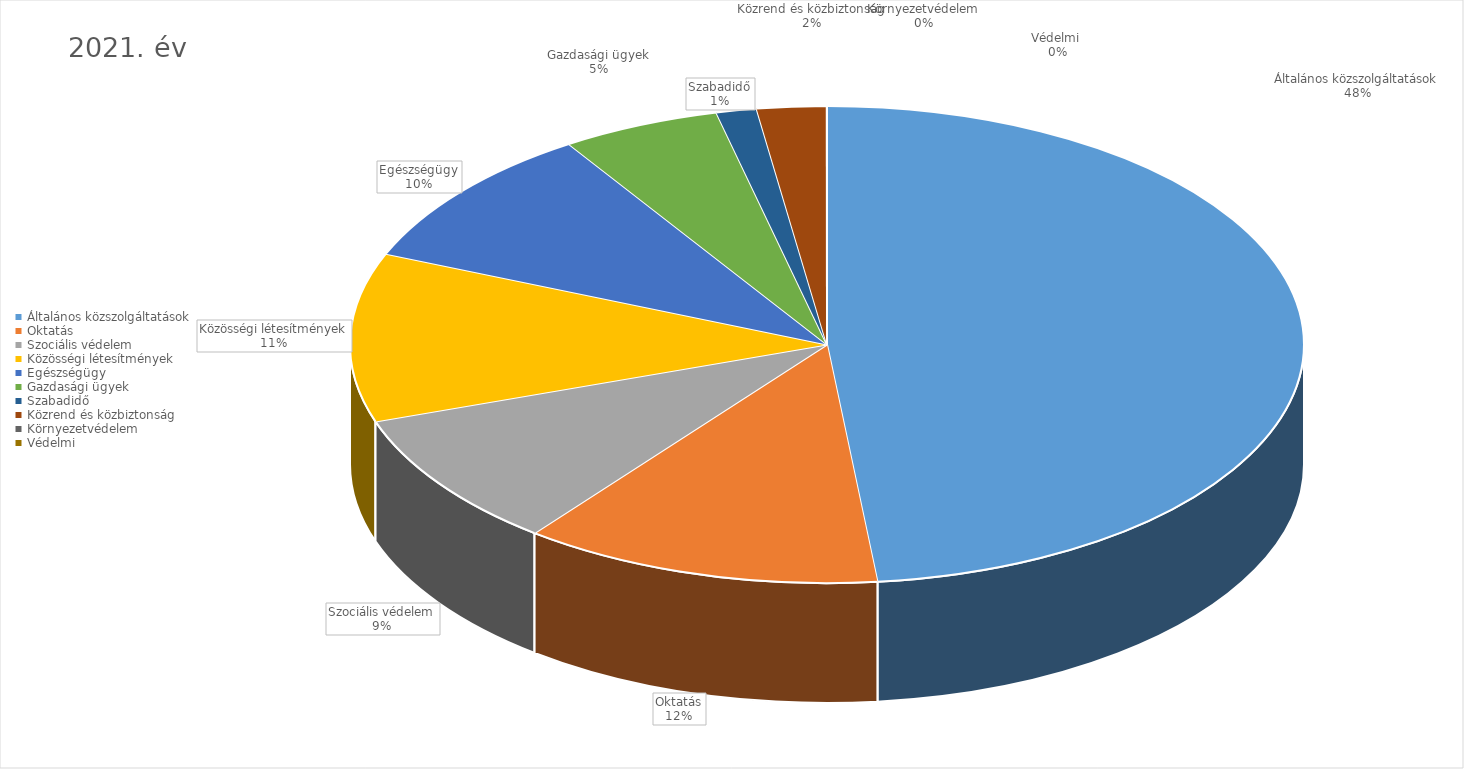
| Category | 2021. év |
|---|---|
| Általános közszolgáltatások | 18651066633 |
| Oktatás | 4704822109 |
| Szociális védelem | 3577072636 |
| Közösségi létesítmények | 4419613500 |
| Egészségügy | 3736015748 |
| Gazdasági ügyek | 2075751558 |
| Szabadidő | 528257580 |
| Közrend és közbiztonság | 909016721 |
| Környezetvédelem | 0 |
| Védelmi  | 1600000 |